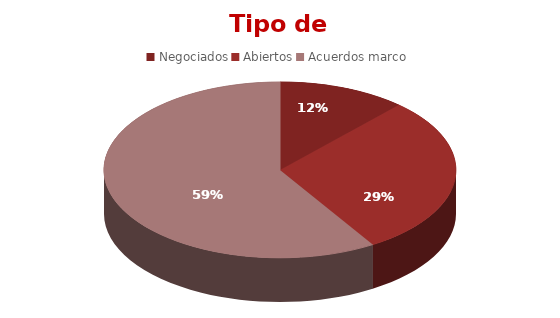
| Category | Series 0 |
|---|---|
| Negociados | 2 |
| Abiertos | 5 |
| Acuerdos marco | 10 |